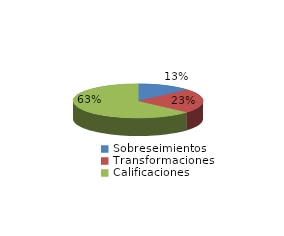
| Category | Series 0 |
|---|---|
| Sobreseimientos | 254 |
| Transformaciones | 439 |
| Calificaciones | 1195 |